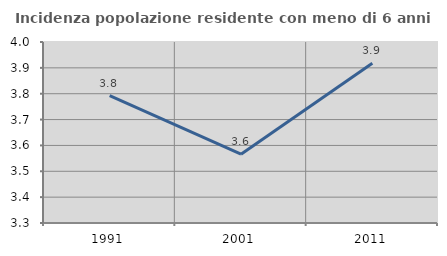
| Category | Incidenza popolazione residente con meno di 6 anni |
|---|---|
| 1991.0 | 3.793 |
| 2001.0 | 3.566 |
| 2011.0 | 3.918 |